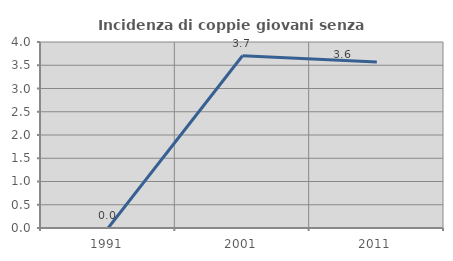
| Category | Incidenza di coppie giovani senza figli |
|---|---|
| 1991.0 | 0 |
| 2001.0 | 3.704 |
| 2011.0 | 3.571 |